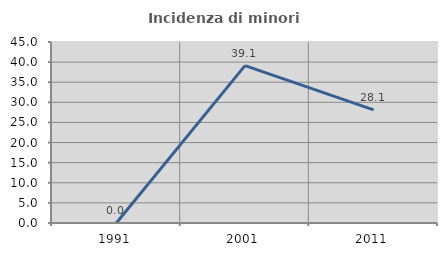
| Category | Incidenza di minori stranieri |
|---|---|
| 1991.0 | 0 |
| 2001.0 | 39.13 |
| 2011.0 | 28.125 |